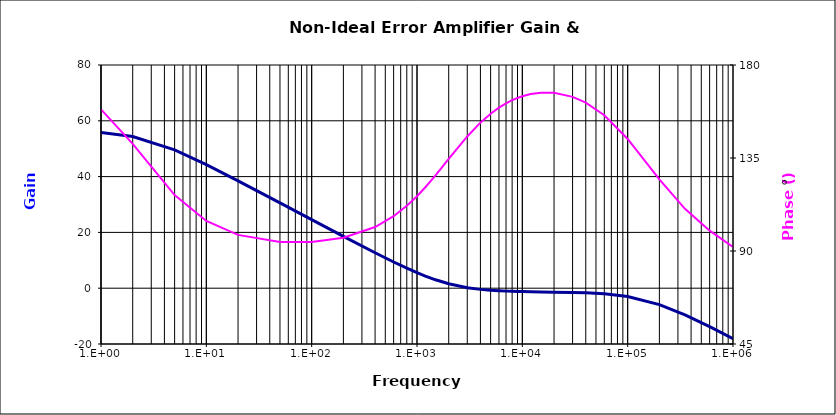
| Category | Error Amplifier Gain |
|---|---|
| 1.0 | 55.852 |
| 2.0 | 54.381 |
| 5.0 | 49.594 |
| 10.0 | 44.298 |
| 20.0 | 38.479 |
| 50.0 | 30.581 |
| 100.0 | 24.577 |
| 200.0 | 18.592 |
| 400.0 | 12.701 |
| 600.0 | 9.387 |
| 800.0 | 7.162 |
| 1000.0 | 5.554 |
| 1200.0 | 4.341 |
| 1500.0 | 3.013 |
| 2000.0 | 1.597 |
| 3000.0 | 0.198 |
| 4000.0 | -0.423 |
| 5000.0 | -0.744 |
| 6000.0 | -0.93 |
| 7000.0 | -1.048 |
| 8000.0 | -1.127 |
| 9000.0 | -1.183 |
| 10000.0 | -1.226 |
| 12000.0 | -1.285 |
| 15000.0 | -1.342 |
| 20000.0 | -1.409 |
| 30000.0 | -1.529 |
| 40000.0 | -1.668 |
| 60000.0 | -2.028 |
| 100000.0 | -3.002 |
| 200000.0 | -5.88 |
| 350000.0 | -9.561 |
| 600000.0 | -13.796 |
| 1000000.0 | -18.105 |